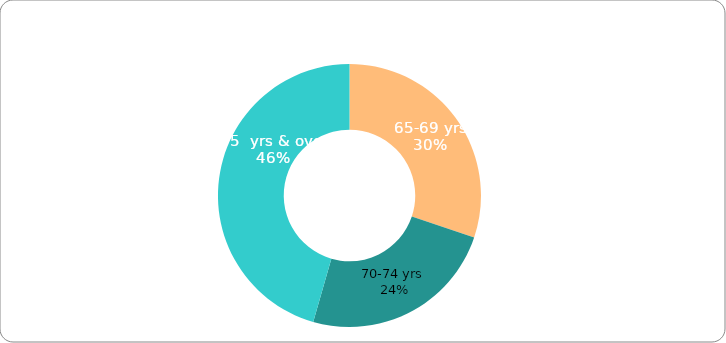
| Category | Series 0 |
|---|---|
| 65-69 yrs | 5533 |
| 70-74 yrs  | 4454 |
| 75  yrs & over | 8354 |